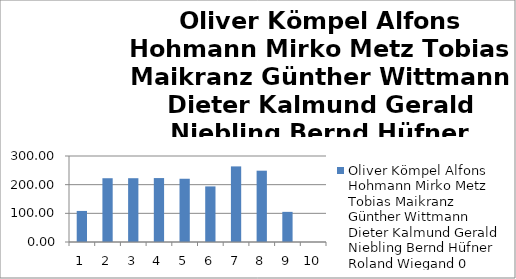
| Category | Oliver Kömpel Alfons Hohmann Mirko Metz Tobias Maikranz Günther Wittmann Dieter Kalmund Gerald Niebling Bernd Hüfner Roland Wiegand 0 |
|---|---|
| 0 | 108.37 |
| 1 | 222.46 |
| 2 | 222.52 |
| 3 | 223.02 |
| 4 | 220.63 |
| 5 | 193.9 |
| 6 | 263.73 |
| 7 | 248.78 |
| 8 | 105.13 |
| 9 | 0 |